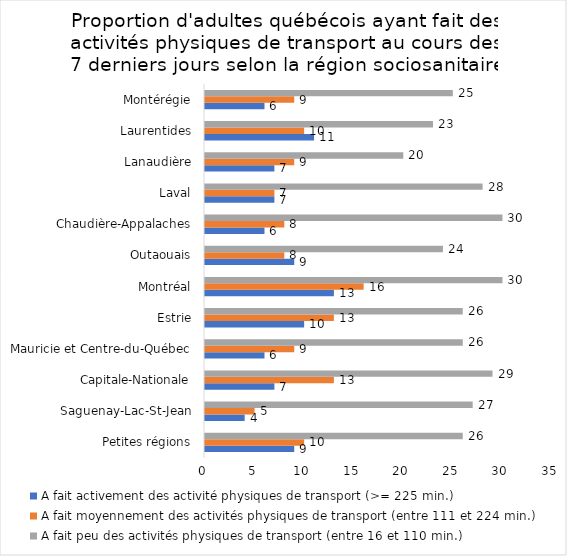
| Category | A fait activement des activité physiques de transport (>= 225 min.) | A fait moyennement des activités physiques de transport (entre 111 et 224 min.) | A fait peu des activités physiques de transport (entre 16 et 110 min.) |
|---|---|---|---|
| Petites régions | 9 | 10 | 26 |
| Saguenay-Lac-St-Jean | 4 | 5 | 27 |
| Capitale-Nationale | 7 | 13 | 29 |
| Mauricie et Centre-du-Québec | 6 | 9 | 26 |
| Estrie | 10 | 13 | 26 |
| Montréal | 13 | 16 | 30 |
| Outaouais | 9 | 8 | 24 |
| Chaudière-Appalaches | 6 | 8 | 30 |
| Laval | 7 | 7 | 28 |
| Lanaudière | 7 | 9 | 20 |
| Laurentides | 11 | 10 | 23 |
| Montérégie | 6 | 9 | 25 |